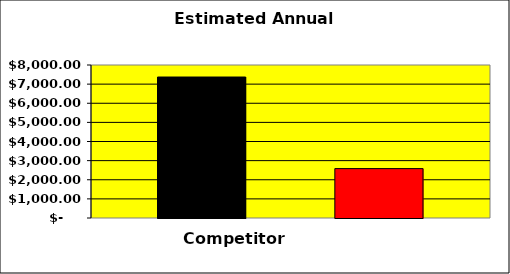
| Category | Series 0 | Series 1 | Series 2 |
|---|---|---|---|
| 0 | 7371.083 |  | 2582.917 |